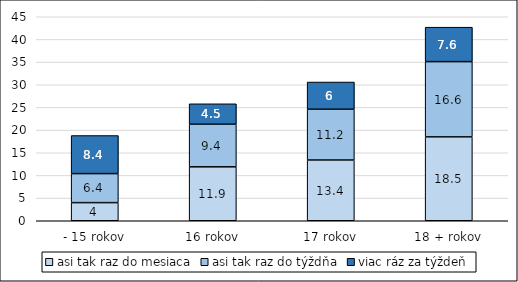
| Category | asi tak raz do mesiaca | asi tak raz do týždňa | viac ráz za týždeň |
|---|---|---|---|
| - 15 rokov | 4 | 6.4 | 8.4 |
| 16 rokov | 11.9 | 9.4 | 4.5 |
| 17 rokov | 13.4 | 11.2 | 6 |
| 18 + rokov | 18.5 | 16.6 | 7.6 |